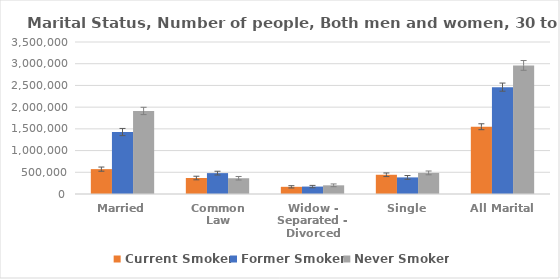
| Category | Current Smoker | Former Smoker | Never Smoker |
|---|---|---|---|
| Married | 572868 | 1426834 | 1912579 |
| Common Law | 368096 | 480757 | 362891 |
| Widow - Separated - Divorced | 165218 | 171110 | 199892 |
| Single | 442832 | 382187 | 485608 |
| All Marital | 1549014 | 2460888 | 2960970 |